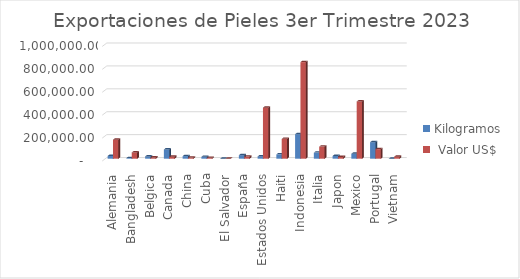
| Category | Kilogramos |  Valor US$ |
|---|---|---|
| Alemania | 23907.09 | 165974.82 |
| Bangladesh | 5653.54 | 54507.79 |
| Belgica | 20000 | 11000 |
| Canada | 80701.4 | 17621.38 |
| China | 22781.6 | 10067.18 |
| Cuba | 16559 | 7451.55 |
| El Salvador | 14 | 272.98 |
| España | 30545 | 18327 |
| Estados Unidos | 19887.67 | 445495.25 |
| Haiti | 37897.57 | 173365.5 |
| Indonesia | 213825 | 843224.2 |
| Italia | 53000 | 105656.24 |
| Japon | 24000 | 15600 |
| Mexico | 43163.2 | 499580.62 |
| Portugal | 144000 | 83600 |
| Vietnam | 504.4 | 17500.74 |